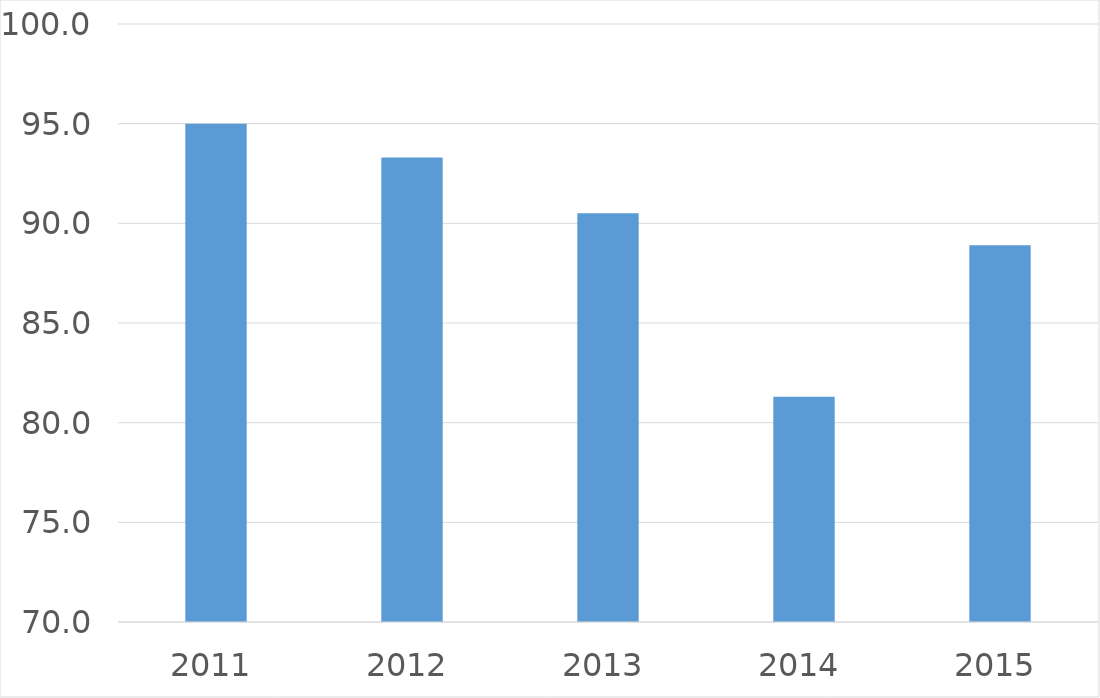
| Category | Series 0 |
|---|---|
| 2011 | 95 |
| 2012 | 93.3 |
| 2013 | 90.5 |
| 2014 | 81.3 |
| 2015 | 88.9 |